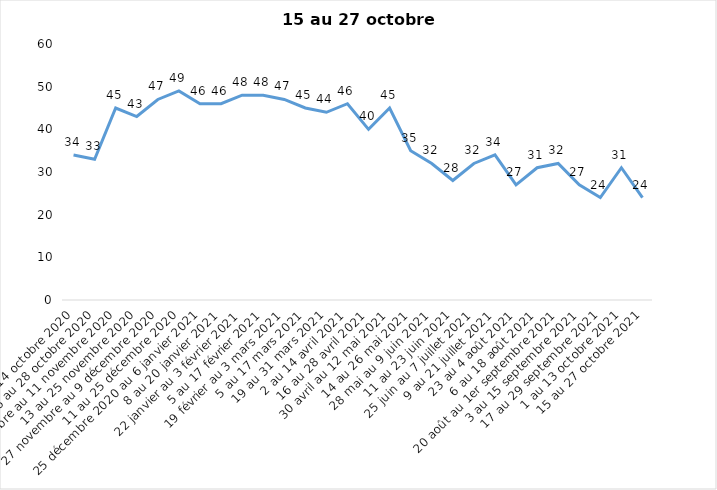
| Category | Toujours aux trois mesures |
|---|---|
| 2 au 14 octobre 2020 | 34 |
| 16 au 28 octobre 2020 | 33 |
| 30 octobre au 11 novembre 2020 | 45 |
| 13 au 25 novembre 2020 | 43 |
| 27 novembre au 9 décembre 2020 | 47 |
| 11 au 25 décembre 2020 | 49 |
| 25 décembre 2020 au 6 janvier 2021 | 46 |
| 8 au 20 janvier 2021 | 46 |
| 22 janvier au 3 février 2021 | 48 |
| 5 au 17 février 2021 | 48 |
| 19 février au 3 mars 2021 | 47 |
| 5 au 17 mars 2021 | 45 |
| 19 au 31 mars 2021 | 44 |
| 2 au 14 avril 2021 | 46 |
| 16 au 28 avril 2021 | 40 |
| 30 avril au 12 mai 2021 | 45 |
| 14 au 26 mai 2021 | 35 |
| 28 mai au 9 juin 2021 | 32 |
| 11 au 23 juin 2021 | 28 |
| 25 juin au 7 juillet 2021 | 32 |
| 9 au 21 juillet 2021 | 34 |
| 23 au 4 août 2021 | 27 |
| 6 au 18 août 2021 | 31 |
| 20 août au 1er septembre 2021 | 32 |
| 3 au 15 septembre 2021 | 27 |
| 17 au 29 septembre 2021 | 24 |
| 1 au 13 octobre 2021 | 31 |
| 15 au 27 octobre 2021 | 24 |